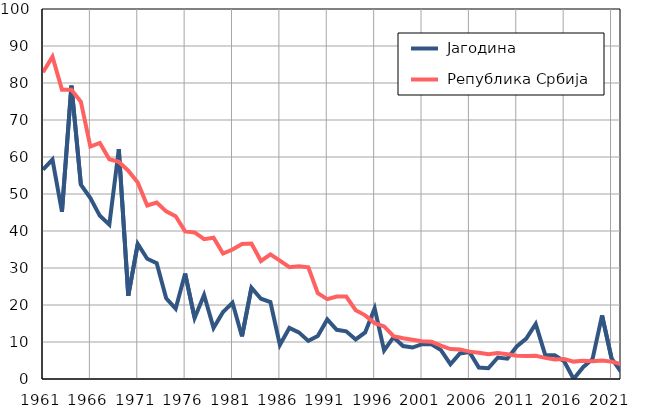
| Category |  Јагодина |  Република Србија |
|---|---|---|
| 1961.0 | 56.6 | 82.9 |
| 1962.0 | 59.3 | 87.1 |
| 1963.0 | 45.2 | 78.2 |
| 1964.0 | 79.3 | 78.2 |
| 1965.0 | 52.5 | 74.9 |
| 1966.0 | 48.9 | 62.8 |
| 1967.0 | 44.1 | 63.8 |
| 1968.0 | 41.7 | 59.4 |
| 1969.0 | 62.1 | 58.7 |
| 1970.0 | 22.5 | 56.3 |
| 1971.0 | 36.5 | 53.1 |
| 1972.0 | 32.5 | 46.9 |
| 1973.0 | 31.3 | 47.7 |
| 1974.0 | 21.8 | 45.3 |
| 1975.0 | 19 | 44 |
| 1976.0 | 28.5 | 39.9 |
| 1977.0 | 16.5 | 39.6 |
| 1978.0 | 22.7 | 37.8 |
| 1979.0 | 13.8 | 38.2 |
| 1980.0 | 18.1 | 33.9 |
| 1981.0 | 20.6 | 35 |
| 1982.0 | 11.5 | 36.5 |
| 1983.0 | 24.7 | 36.6 |
| 1984.0 | 21.7 | 31.9 |
| 1985.0 | 20.8 | 33.7 |
| 1986.0 | 9.2 | 32 |
| 1987.0 | 13.8 | 30.2 |
| 1988.0 | 12.6 | 30.5 |
| 1989.0 | 10.3 | 30.2 |
| 1990.0 | 11.6 | 23.2 |
| 1991.0 | 16.1 | 21.6 |
| 1992.0 | 13.3 | 22.3 |
| 1993.0 | 12.9 | 22.3 |
| 1994.0 | 10.7 | 18.6 |
| 1995.0 | 12.6 | 17.2 |
| 1996.0 | 19.1 | 15.1 |
| 1997.0 | 7.7 | 14.2 |
| 1998.0 | 11.3 | 11.6 |
| 1999.0 | 8.9 | 11 |
| 2000.0 | 8.5 | 10.6 |
| 2001.0 | 9.4 | 10.2 |
| 2002.0 | 9.4 | 10.1 |
| 2003.0 | 7.8 | 9 |
| 2004.0 | 4 | 8.1 |
| 2005.0 | 6.9 | 8 |
| 2006.0 | 7.3 | 7.4 |
| 2007.0 | 3.1 | 7.1 |
| 2008.0 | 2.9 | 6.7 |
| 2009.0 | 5.8 | 7 |
| 2010.0 | 5.5 | 6.7 |
| 2011.0 | 8.8 | 6.3 |
| 2012.0 | 10.9 | 6.2 |
| 2013.0 | 14.9 | 6.3 |
| 2014.0 | 6.5 | 5.7 |
| 2015.0 | 6.4 | 5.3 |
| 2016.0 | 4.8 | 5.4 |
| 2017.0 | 0 | 4.7 |
| 2018.0 | 3.2 | 4.9 |
| 2019.0 | 5.4 | 4.8 |
| 2020.0 | 17.2 | 5 |
| 2021.0 | 5.6 | 4.7 |
| 2022.0 | 1.9 | 4 |